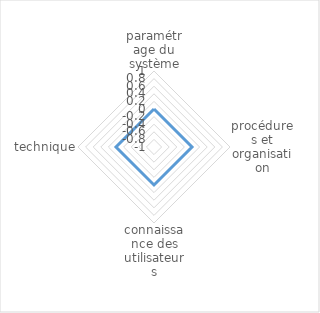
| Category | Series 0 |
|---|---|
| paramétrage du système | 0 |
| procédures et organisation | 0 |
| connaissance des utilisateurs | 0 |
| technique | 0 |